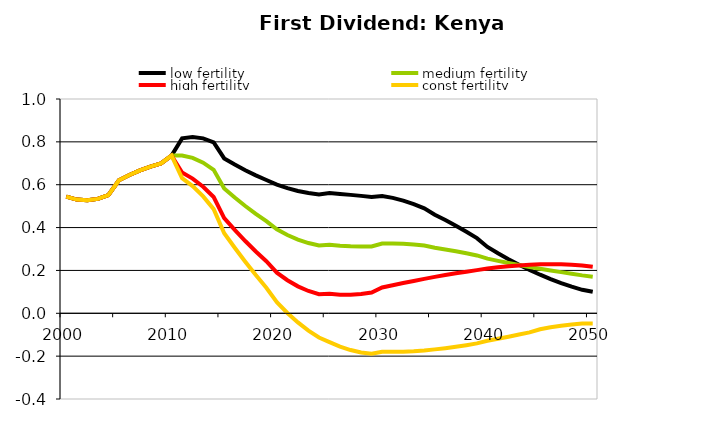
| Category | low fertility | medium fertility | high fertility | const fertility |
|---|---|---|---|---|
| 2000.0 | 0.545 | 0.545 | 0.545 | 0.545 |
| 2001.0 | 0.531 | 0.531 | 0.531 | 0.531 |
| 2002.0 | 0.527 | 0.527 | 0.527 | 0.527 |
| 2003.0 | 0.534 | 0.534 | 0.534 | 0.534 |
| 2004.0 | 0.551 | 0.551 | 0.551 | 0.551 |
| 2005.0 | 0.621 | 0.621 | 0.621 | 0.621 |
| 2006.0 | 0.645 | 0.645 | 0.645 | 0.645 |
| 2007.0 | 0.667 | 0.667 | 0.667 | 0.667 |
| 2008.0 | 0.685 | 0.685 | 0.685 | 0.685 |
| 2009.0 | 0.7 | 0.7 | 0.7 | 0.7 |
| 2010.0 | 0.736 | 0.736 | 0.736 | 0.736 |
| 2011.0 | 0.816 | 0.736 | 0.656 | 0.631 |
| 2012.0 | 0.822 | 0.725 | 0.629 | 0.594 |
| 2013.0 | 0.816 | 0.703 | 0.591 | 0.545 |
| 2014.0 | 0.798 | 0.669 | 0.542 | 0.486 |
| 2015.0 | 0.723 | 0.582 | 0.444 | 0.373 |
| 2016.0 | 0.694 | 0.54 | 0.389 | 0.306 |
| 2017.0 | 0.668 | 0.501 | 0.337 | 0.241 |
| 2018.0 | 0.644 | 0.464 | 0.288 | 0.178 |
| 2019.0 | 0.622 | 0.43 | 0.243 | 0.119 |
| 2020.0 | 0.6 | 0.392 | 0.19 | 0.052 |
| 2021.0 | 0.584 | 0.365 | 0.154 | 0.002 |
| 2022.0 | 0.571 | 0.344 | 0.126 | -0.043 |
| 2023.0 | 0.561 | 0.328 | 0.104 | -0.081 |
| 2024.0 | 0.554 | 0.316 | 0.089 | -0.113 |
| 2025.0 | 0.561 | 0.32 | 0.091 | -0.135 |
| 2026.0 | 0.557 | 0.315 | 0.087 | -0.155 |
| 2027.0 | 0.553 | 0.313 | 0.087 | -0.172 |
| 2028.0 | 0.548 | 0.311 | 0.09 | -0.183 |
| 2029.0 | 0.543 | 0.312 | 0.097 | -0.189 |
| 2030.0 | 0.548 | 0.325 | 0.12 | -0.18 |
| 2031.0 | 0.539 | 0.326 | 0.131 | -0.18 |
| 2032.0 | 0.526 | 0.324 | 0.141 | -0.179 |
| 2033.0 | 0.51 | 0.321 | 0.151 | -0.177 |
| 2034.0 | 0.49 | 0.316 | 0.16 | -0.174 |
| 2035.0 | 0.46 | 0.306 | 0.17 | -0.168 |
| 2036.0 | 0.435 | 0.298 | 0.179 | -0.163 |
| 2037.0 | 0.408 | 0.29 | 0.187 | -0.156 |
| 2038.0 | 0.38 | 0.28 | 0.194 | -0.149 |
| 2039.0 | 0.351 | 0.27 | 0.201 | -0.14 |
| 2040.0 | 0.309 | 0.255 | 0.209 | -0.128 |
| 2041.0 | 0.28 | 0.245 | 0.215 | -0.119 |
| 2042.0 | 0.252 | 0.235 | 0.22 | -0.109 |
| 2043.0 | 0.227 | 0.225 | 0.223 | -0.099 |
| 2044.0 | 0.203 | 0.216 | 0.226 | -0.089 |
| 2045.0 | 0.18 | 0.208 | 0.228 | -0.074 |
| 2046.0 | 0.16 | 0.2 | 0.229 | -0.066 |
| 2047.0 | 0.141 | 0.192 | 0.228 | -0.058 |
| 2048.0 | 0.124 | 0.184 | 0.226 | -0.052 |
| 2049.0 | 0.109 | 0.177 | 0.223 | -0.048 |
| 2050.0 | 0.1 | 0.171 | 0.217 | -0.048 |